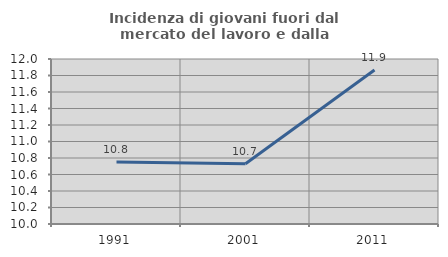
| Category | Incidenza di giovani fuori dal mercato del lavoro e dalla formazione  |
|---|---|
| 1991.0 | 10.751 |
| 2001.0 | 10.731 |
| 2011.0 | 11.866 |